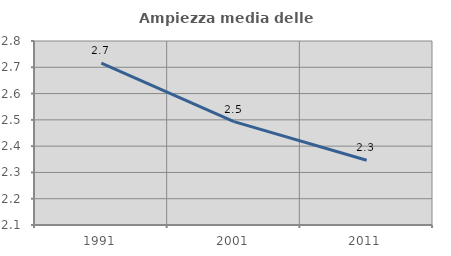
| Category | Ampiezza media delle famiglie |
|---|---|
| 1991.0 | 2.716 |
| 2001.0 | 2.493 |
| 2011.0 | 2.346 |